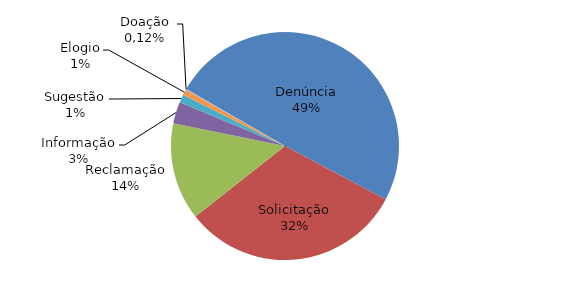
| Category | Series 0 |
|---|---|
| Denúncia | 5099 |
| Solicitação | 3257 |
| Reclamação | 1426 |
| Informação | 316 |
| Sugestão | 118 |
| Elogio | 83 |
| Doação | 12 |